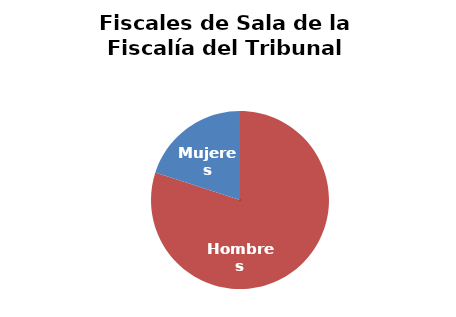
| Category | Fiscales de Sala de la Fiscalía del Tribunal Supremo |
|---|---|
| Hombres | 12 |
| Mujeres | 3 |